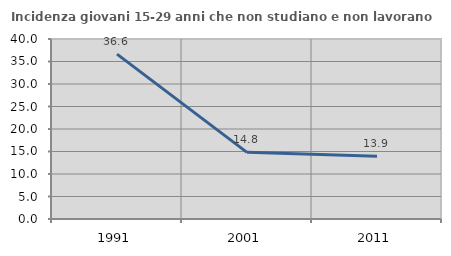
| Category | Incidenza giovani 15-29 anni che non studiano e non lavorano  |
|---|---|
| 1991.0 | 36.641 |
| 2001.0 | 14.815 |
| 2011.0 | 13.95 |